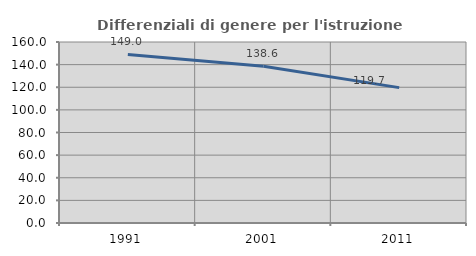
| Category | Differenziali di genere per l'istruzione superiore |
|---|---|
| 1991.0 | 149.023 |
| 2001.0 | 138.623 |
| 2011.0 | 119.664 |